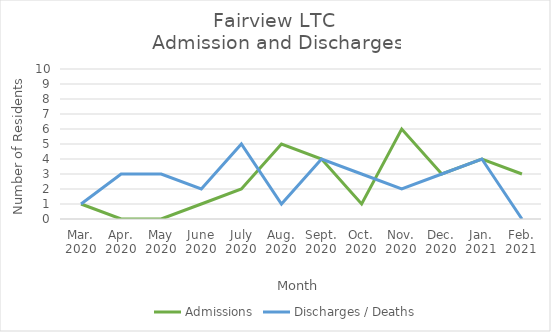
| Category | Admissions | Discharges / Deaths |
|---|---|---|
| Mar.
2020 | 1 | 1 |
| Apr.
2020 | 0 | 3 |
| May
2020 | 0 | 3 |
| June
2020 | 1 | 2 |
| July
2020 | 2 | 5 |
| Aug.
2020 | 5 | 1 |
| Sept.
2020 | 4 | 4 |
| Oct.
2020 | 1 | 3 |
| Nov.
2020 | 6 | 2 |
| Dec.
2020 | 3 | 3 |
| Jan.
2021 | 4 | 4 |
| Feb.
2021 | 3 | 0 |